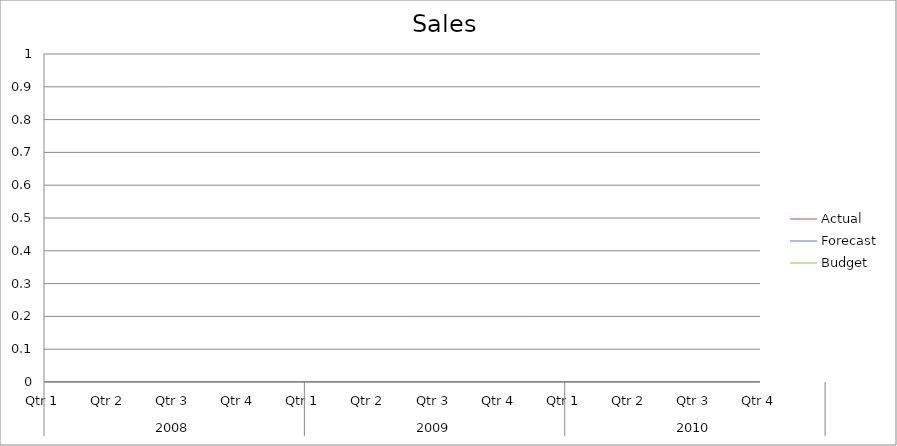
| Category | Budget | Forecast | Actual |
|---|---|---|---|
| 0 | 1470 | 870 | 3420 |
| 1 | 1000 | 3190 | 1850 |
| 2 | 2930 | 2840 | 3290 |
| 3 | 1110 | 2110 | 2050 |
| 4 | 3300 | 3340 | 1940 |
| 5 | 2190 | 3360 | 3290 |
| 6 | 2370 | 1280 | 1860 |
| 7 | 870 | 1750 | 2000 |
| 8 | 3200 | 1820 | 2130 |
| 9 | 1680 | 3430 | 1160 |
| 10 | 1380 | 3270 | 2780 |
| 11 | 1290 | 930 | 1270 |